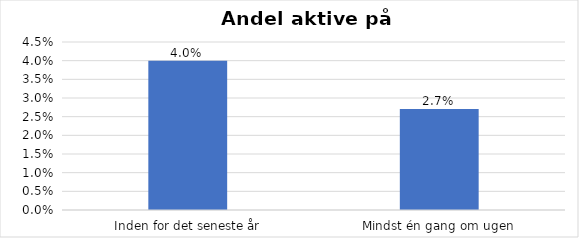
| Category | % |
|---|---|
| Inden for det seneste år | 0.04 |
| Mindst én gang om ugen | 0.027 |